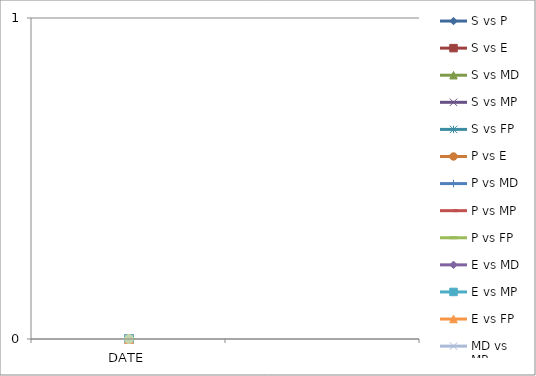
| Category | S vs P | S vs E | S vs MD | S vs MP | S vs FP | P vs E | P vs MD | P vs MP | P vs FP | E vs MD | E vs MP | E vs FP | MD vs MP | MD vs FP | MP vs FP |
|---|---|---|---|---|---|---|---|---|---|---|---|---|---|---|---|
| DATE | 0 | 0 | 0 | 0 | 0 | 0 | 0 | 0 | 0 | 0 | 0 | 0 | 0 | 0 | 0 |